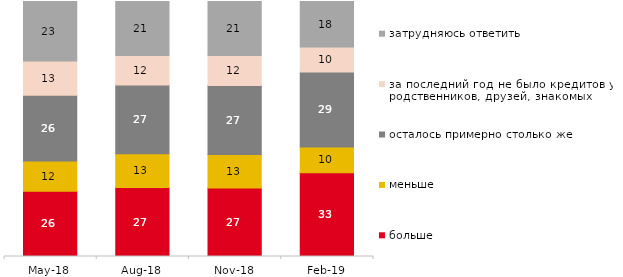
| Category | больше | меньше | осталось примерно столько же | за последний год не было кредитов у родственников, друзей, знакомых | затрудняюсь ответить |
|---|---|---|---|---|---|
| 2018-05-01 | 25.55 | 11.9 | 25.75 | 13.45 | 23.35 |
| 2018-08-01 | 27.05 | 13.2 | 27 | 11.6 | 21.15 |
| 2018-11-01 | 26.896 | 13.074 | 27.096 | 11.776 | 21.158 |
| 2019-02-01 | 32.8 | 10.1 | 29.45 | 9.8 | 17.85 |